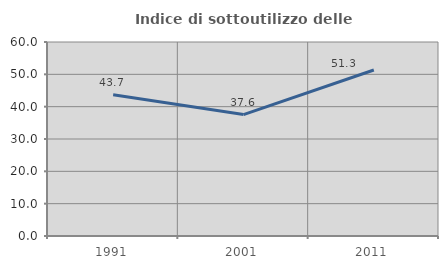
| Category | Indice di sottoutilizzo delle abitazioni  |
|---|---|
| 1991.0 | 43.655 |
| 2001.0 | 37.561 |
| 2011.0 | 51.337 |